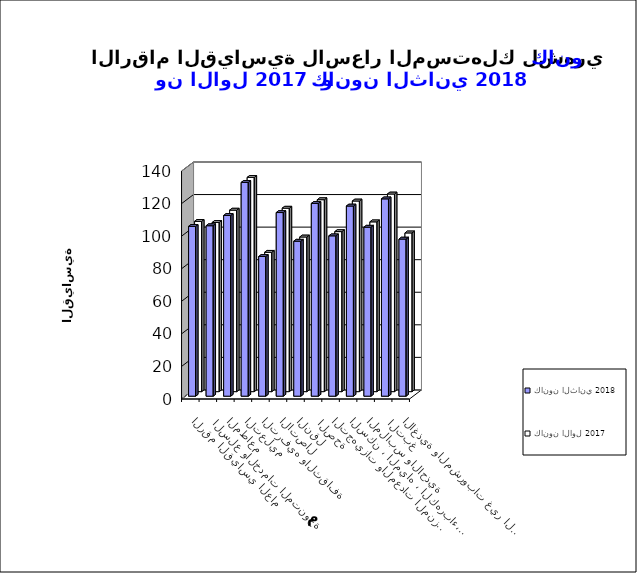
| Category | كانون الثاني 2018      | كانون الاول 2017       |
|---|---|---|
| الاغذية والمشروبات غير الكحولية | 96.5 | 97.5 |
|  التبغ | 121.2 | 121.4 |
| الملابس والاحذية | 103.8 | 104.3 |
| السكن ، المياه ، الكهرباء، الغاز  | 116.8 | 117.1 |
| التجهيزات والمعدات المنزلية والصيانة | 98.5 | 98.3 |
|  الصحة | 118.4 | 117.9 |
| النقل | 95.2 | 95 |
| الاتصال | 112.8 | 112.7 |
| الترفيه والثقافة | 85.8 | 85.6 |
| التعليم | 131.3 | 131.6 |
| المطاعم  | 111 | 111.5 |
|  السلع والخدمات المتنوعة | 104.7 | 103.9 |
| الرقم القياسي العام | 104.3 | 104.6 |